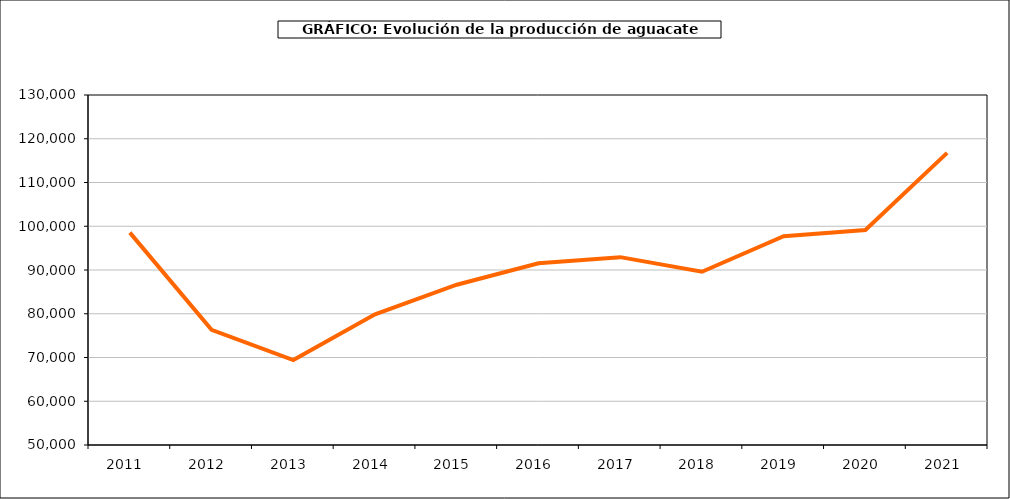
| Category | producción aguacate |
|---|---|
| 2011.0 | 98535 |
| 2012.0 | 76337 |
| 2013.0 | 69427 |
| 2014.0 | 79886 |
| 2015.0 | 86636 |
| 2016.0 | 91530 |
| 2017.0 | 92936 |
| 2018.0 | 89592 |
| 2019.0 | 97727 |
| 2020.0 | 99125 |
| 2021.0 | 116769 |